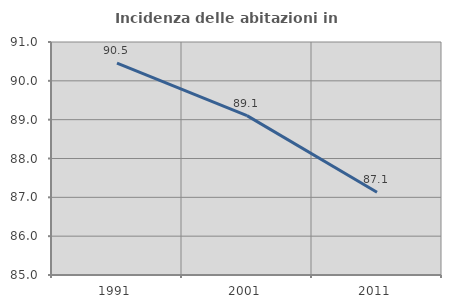
| Category | Incidenza delle abitazioni in proprietà  |
|---|---|
| 1991.0 | 90.456 |
| 2001.0 | 89.103 |
| 2011.0 | 87.133 |